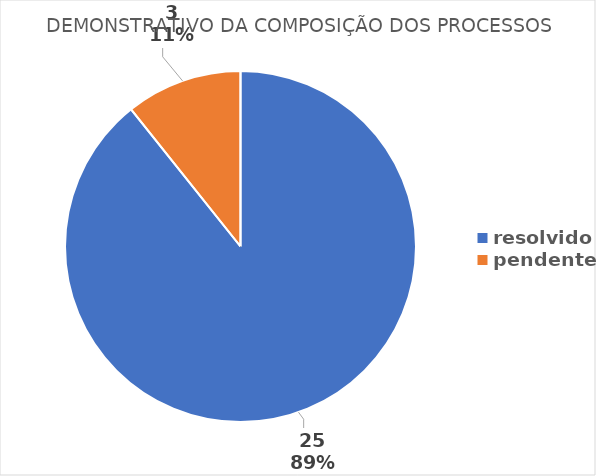
| Category | Series 0 |
|---|---|
| resolvido | 25 |
| pendente | 3 |